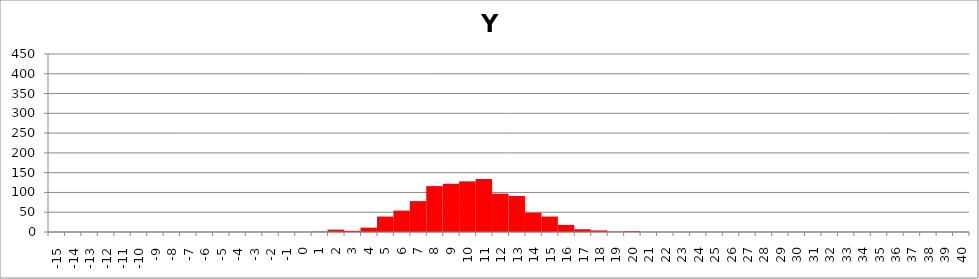
| Category | Freq v y |
|---|---|
| -15.0 | 0 |
| -14.0 | 0 |
| -13.0 | 0 |
| -12.0 | 0 |
| -11.0 | 0 |
| -10.0 | 0 |
| -9.0 | 0 |
| -8.0 | 0 |
| -7.0 | 0 |
| -6.0 | 0 |
| -5.0 | 0 |
| -4.0 | 0 |
| -3.0 | 0 |
| -2.0 | 0 |
| -1.0 | 0 |
| 0.0 | 0 |
| 1.0 | 1 |
| 2.0 | 6 |
| 3.0 | 3 |
| 4.0 | 11 |
| 5.0 | 39 |
| 6.0 | 54 |
| 7.0 | 78 |
| 8.0 | 116 |
| 9.0 | 122 |
| 10.0 | 128 |
| 11.0 | 134 |
| 12.0 | 97 |
| 13.0 | 91 |
| 14.0 | 49 |
| 15.0 | 39 |
| 16.0 | 18 |
| 17.0 | 7 |
| 18.0 | 4 |
| 19.0 | 1 |
| 20.0 | 2 |
| 21.0 | 0 |
| 22.0 | 0 |
| 23.0 | 0 |
| 24.0 | 0 |
| 25.0 | 0 |
| 26.0 | 0 |
| 27.0 | 0 |
| 28.0 | 0 |
| 29.0 | 0 |
| 30.0 | 0 |
| 31.0 | 0 |
| 32.0 | 0 |
| 33.0 | 0 |
| 34.0 | 0 |
| 35.0 | 0 |
| 36.0 | 0 |
| 37.0 | 0 |
| 38.0 | 0 |
| 39.0 | 0 |
| 40.0 | 0 |